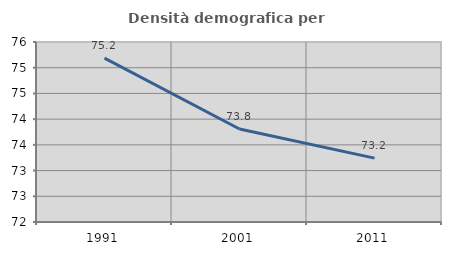
| Category | Densità demografica |
|---|---|
| 1991.0 | 75.185 |
| 2001.0 | 73.808 |
| 2011.0 | 73.243 |